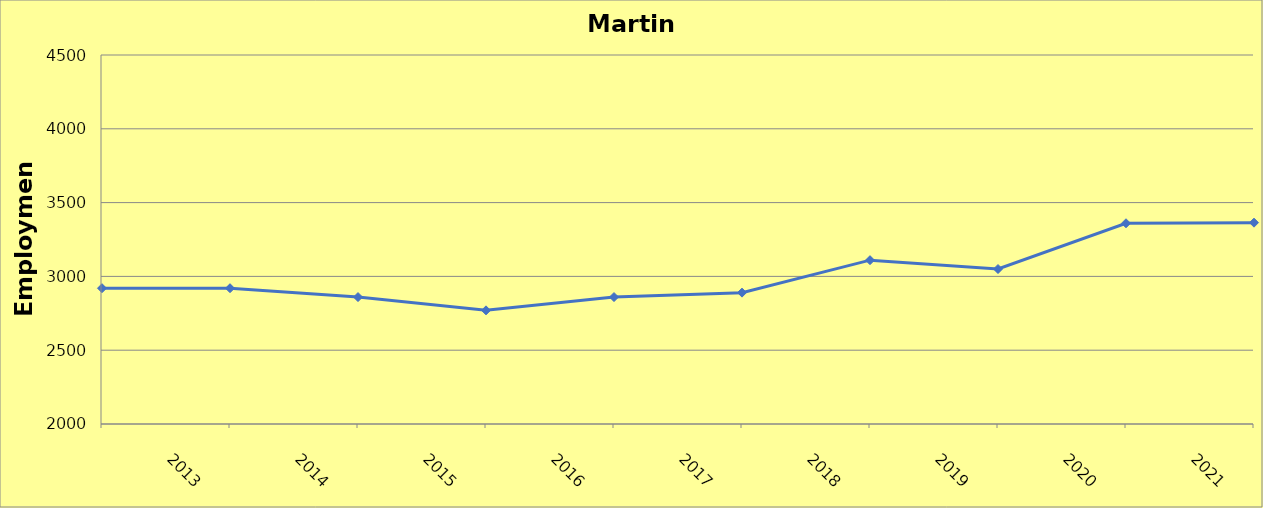
| Category | Martin County |
|---|---|
| 2013.0 | 2920 |
| 2014.0 | 2920 |
| 2015.0 | 2860 |
| 2016.0 | 2770 |
| 2017.0 | 2860 |
| 2018.0 | 2890 |
| 2019.0 | 3110 |
| 2020.0 | 3050 |
| 2021.0 | 3360 |
| 2022.0 | 3364 |